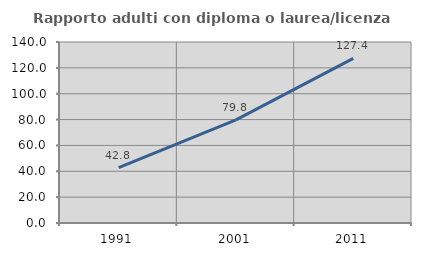
| Category | Rapporto adulti con diploma o laurea/licenza media  |
|---|---|
| 1991.0 | 42.802 |
| 2001.0 | 79.775 |
| 2011.0 | 127.358 |